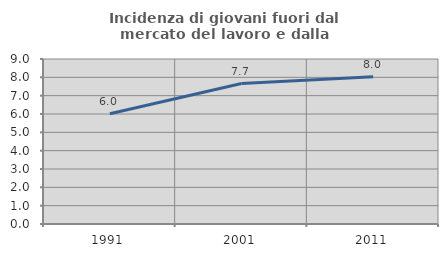
| Category | Incidenza di giovani fuori dal mercato del lavoro e dalla formazione  |
|---|---|
| 1991.0 | 6.014 |
| 2001.0 | 7.663 |
| 2011.0 | 8.038 |